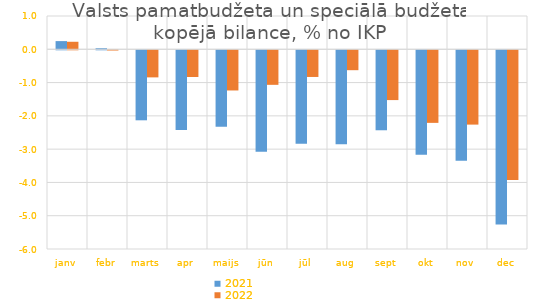
| Category | 2021 | 2022 |
|---|---|---|
| janv | 0.246 | 0.226 |
| febr | 0.032 | -0.007 |
| marts | -2.104 | -0.814 |
| apr | -2.396 | -0.802 |
| maijs | -2.297 | -1.207 |
| jūn | -3.048 | -1.038 |
| jūl | -2.81 | -0.801 |
| aug | -2.821 | -0.598 |
| sept | -2.403 | -1.496 |
| okt | -3.135 | -2.181 |
| nov | -3.32 | -2.233 |
| dec | -5.233 | -3.895 |